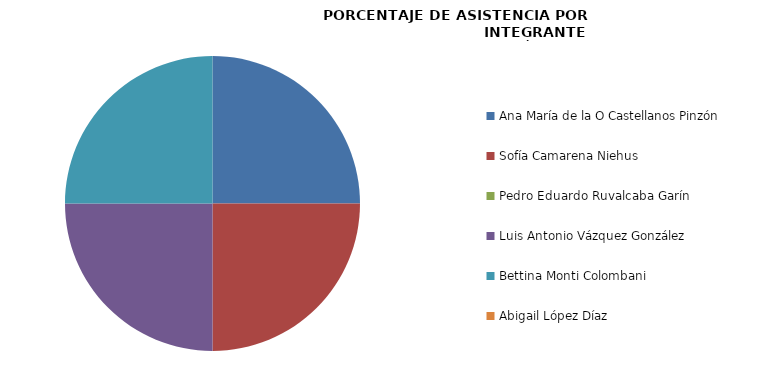
| Category | Series 0 |
|---|---|
| Ana María de la O Castellanos Pinzón | 100 |
| Sofía Camarena Niehus | 100 |
| Pedro Eduardo Ruvalcaba Garín | 0 |
| Luis Antonio Vázquez González | 100 |
| Bettina Monti Colombani | 100 |
| Abigail López Díaz | 0 |